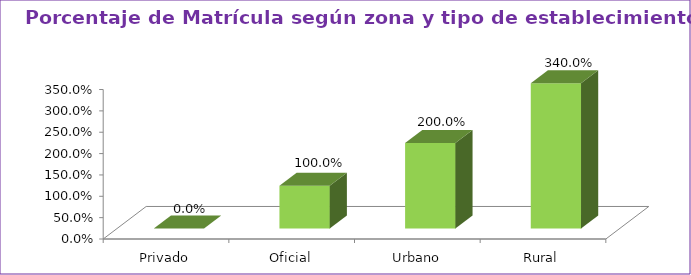
| Category | Series 1 |
|---|---|
| Privado | 0 |
| Oficial | 1 |
| Urbano | 2 |
| Rural | 3.4 |